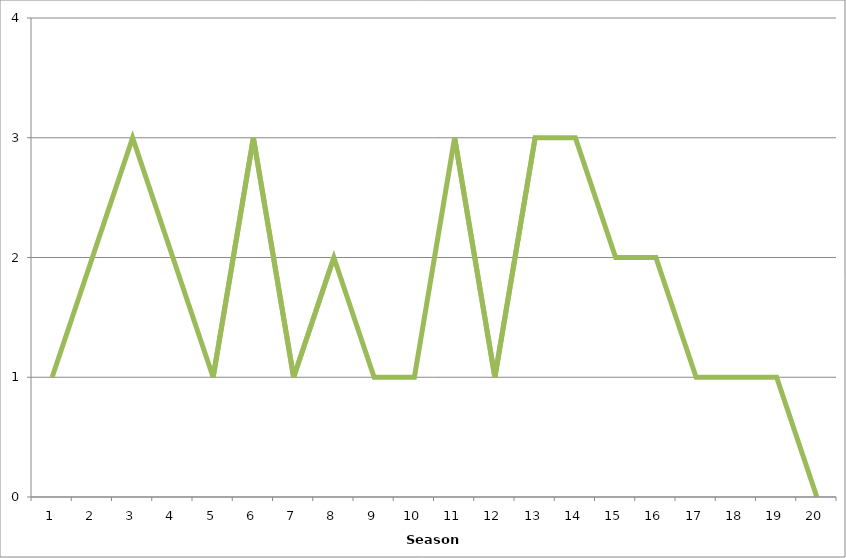
| Category | Series 2 |
|---|---|
| 0 | 1 |
| 1 | 2 |
| 2 | 3 |
| 3 | 2 |
| 4 | 1 |
| 5 | 3 |
| 6 | 1 |
| 7 | 2 |
| 8 | 1 |
| 9 | 1 |
| 10 | 3 |
| 11 | 1 |
| 12 | 3 |
| 13 | 3 |
| 14 | 2 |
| 15 | 2 |
| 16 | 1 |
| 17 | 1 |
| 18 | 1 |
| 19 | 0 |